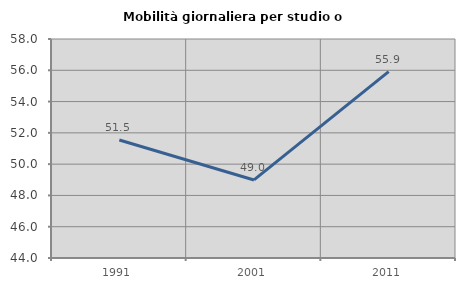
| Category | Mobilità giornaliera per studio o lavoro |
|---|---|
| 1991.0 | 51.539 |
| 2001.0 | 48.989 |
| 2011.0 | 55.914 |